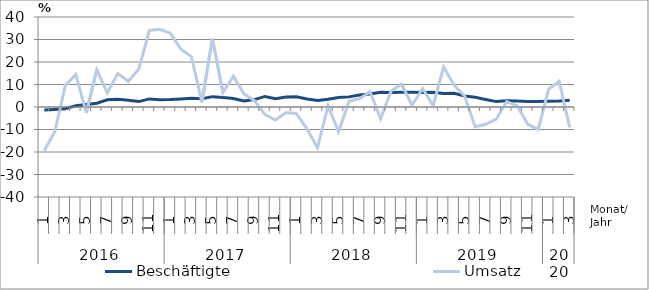
| Category | Beschäftigte | Umsatz |
|---|---|---|
| 0 | -1.3 | -19.4 |
| 1 | -1.1 | -11 |
| 2 | -0.8 | 9.4 |
| 3 | 0.6 | 14.4 |
| 4 | 1.1 | -2.6 |
| 5 | 1.7 | 16.5 |
| 6 | 3.2 | 6.3 |
| 7 | 3.4 | 14.9 |
| 8 | 3 | 11.4 |
| 9 | 2.4 | 16.9 |
| 10 | 3.6 | 34 |
| 11 | 3.2 | 34.5 |
| 12 | 3.3 | 32.8 |
| 13 | 3.6 | 25.7 |
| 14 | 3.9 | 22.4 |
| 15 | 3.7 | 2.1 |
| 16 | 4.6 | 30.4 |
| 17 | 4.2 | 6.4 |
| 18 | 3.8 | 13.7 |
| 19 | 2.7 | 5.8 |
| 20 | 3.3 | 2.8 |
| 21 | 4.7 | -3.4 |
| 22 | 3.7 | -5.8 |
| 23 | 4.4 | -2.5 |
| 24 | 4.5 | -3 |
| 25 | 3.6 | -9.8 |
| 26 | 2.9 | -18.1 |
| 27 | 3.4 | 0.5 |
| 28 | 4.2 | -11 |
| 29 | 4.5 | 2.5 |
| 30 | 5.3 | 3.7 |
| 31 | 5.8 | 6.8 |
| 32 | 6.6 | -5.2 |
| 33 | 6.5 | 7.1 |
| 34 | 6.6 | 10.1 |
| 35 | 6.6 | 0.8 |
| 36 | 6.4 | 8.2 |
| 37 | 6.5 | 0.6 |
| 38 | 6 | 17.8 |
| 39 | 6.1 | 9.6 |
| 40 | 4.9 | 4.9 |
| 41 | 4.3 | -8.8 |
| 42 | 3.3 | -7.7 |
| 43 | 2.4 | -5.4 |
| 44 | 2.8 | 2.4 |
| 45 | 2.7 | 0.5 |
| 46 | 2.5 | -7.6 |
| 47 | 2.5 | -10 |
| 48 | 2.6 | 8 |
| 49 | 2.7 | 11.4 |
| 50 | 3 | -9.1 |